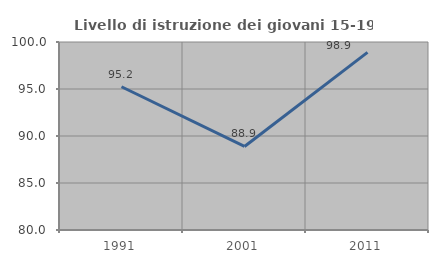
| Category | Livello di istruzione dei giovani 15-19 anni |
|---|---|
| 1991.0 | 95.238 |
| 2001.0 | 88.889 |
| 2011.0 | 98.901 |